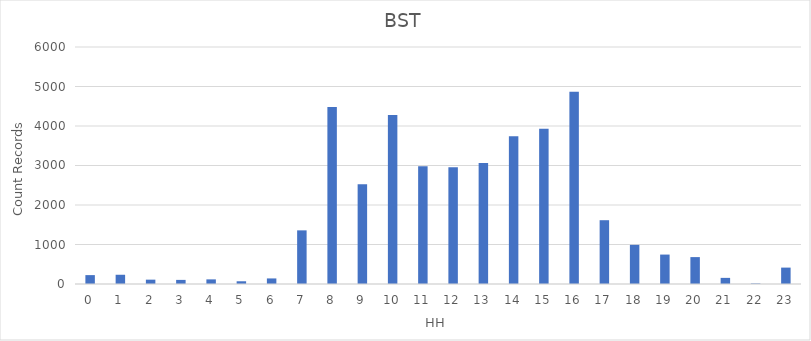
| Category | 43555 |
|---|---|
| 0.0 | 225 |
| 1.0 | 234 |
| 2.0 | 110 |
| 3.0 | 104 |
| 4.0 | 117 |
| 5.0 | 69 |
| 6.0 | 141 |
| 7.0 | 1358 |
| 8.0 | 4482 |
| 9.0 | 2524 |
| 10.0 | 4280 |
| 11.0 | 2978 |
| 12.0 | 2957 |
| 13.0 | 3061 |
| 14.0 | 3740 |
| 15.0 | 3929 |
| 16.0 | 4864 |
| 17.0 | 1615 |
| 18.0 | 991 |
| 19.0 | 745 |
| 20.0 | 681 |
| 21.0 | 155 |
| 22.0 | 13 |
| 23.0 | 415 |